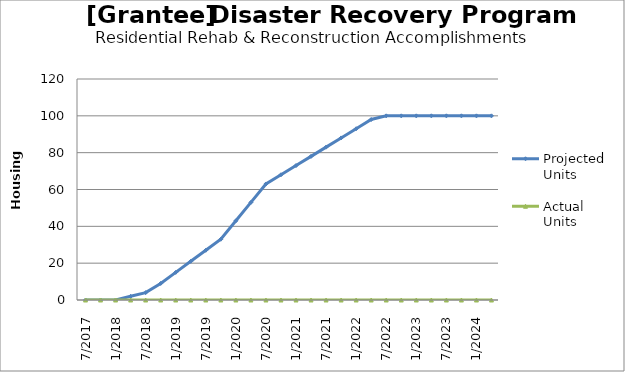
| Category | Projected Units | Actual Units |
|---|---|---|
| 7/2017 | 0 | 0 |
| 10/2017 | 0 | 0 |
| 1/2018 | 0 | 0 |
| 4/2018 | 2 | 0 |
| 7/2018 | 4 | 0 |
| 10/2018 | 9 | 0 |
| 1/2019 | 15 | 0 |
| 4/2019 | 21 | 0 |
| 7/2019 | 27 | 0 |
| 10/2019 | 33 | 0 |
| 1/2020 | 43 | 0 |
| 4/2020 | 53 | 0 |
| 7/2020 | 63 | 0 |
| 10/2020 | 68 | 0 |
| 1/2021 | 73 | 0 |
| 4/2021 | 78 | 0 |
| 7/2021 | 83 | 0 |
| 10/2021 | 88 | 0 |
| 1/2022 | 93 | 0 |
| 4/2022 | 98 | 0 |
| 7/2022 | 100 | 0 |
| 10/2022 | 100 | 0 |
| 1/2023 | 100 | 0 |
| 4/2023 | 100 | 0 |
| 7/2023 | 100 | 0 |
| 10/2023 | 100 | 0 |
| 1/2024 | 100 | 0 |
| 4/2024 | 100 | 0 |